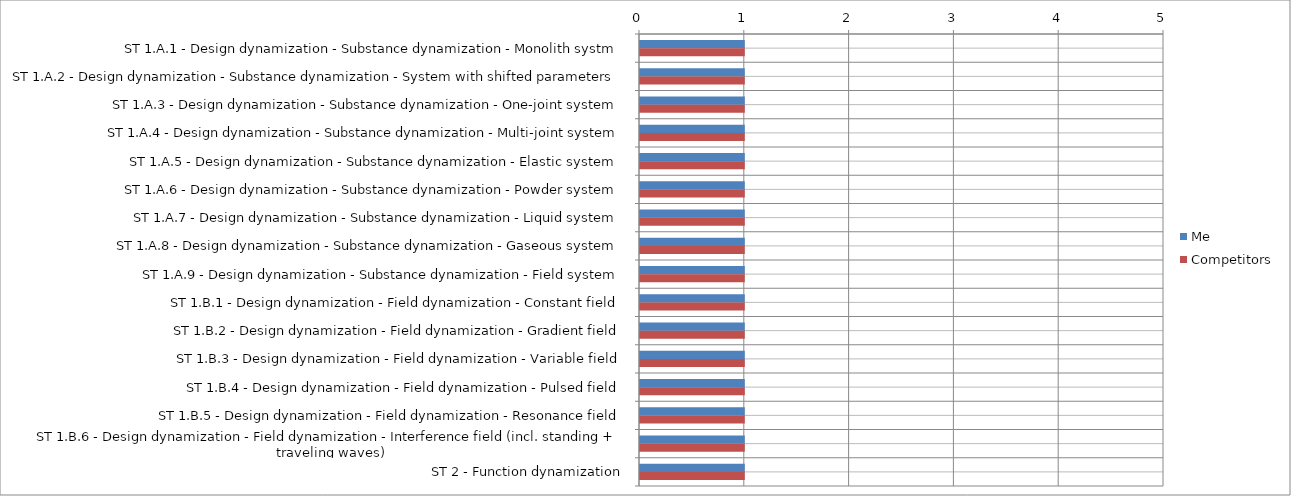
| Category | Me | Competitors |
|---|---|---|
| ST 1.A.1 - Design dynamization - Substance dynamization - Monolith systm | 1 | 1 |
| ST 1.A.2 - Design dynamization - Substance dynamization - System with shifted parameters | 1 | 1 |
| ST 1.A.3 - Design dynamization - Substance dynamization - One-joint system | 1 | 1 |
| ST 1.A.4 - Design dynamization - Substance dynamization - Multi-joint system | 1 | 1 |
| ST 1.A.5 - Design dynamization - Substance dynamization - Elastic system | 1 | 1 |
| ST 1.A.6 - Design dynamization - Substance dynamization - Powder system | 1 | 1 |
| ST 1.A.7 - Design dynamization - Substance dynamization - Liquid system | 1 | 1 |
| ST 1.A.8 - Design dynamization - Substance dynamization - Gaseous system | 1 | 1 |
| ST 1.A.9 - Design dynamization - Substance dynamization - Field system | 1 | 1 |
| ST 1.B.1 - Design dynamization - Field dynamization - Constant field | 1 | 1 |
| ST 1.B.2 - Design dynamization - Field dynamization - Gradient field | 1 | 1 |
| ST 1.B.3 - Design dynamization - Field dynamization - Variable field | 1 | 1 |
| ST 1.B.4 - Design dynamization - Field dynamization - Pulsed field | 1 | 1 |
| ST 1.B.5 - Design dynamization - Field dynamization - Resonance field | 1 | 1 |
| ST 1.B.6 - Design dynamization - Field dynamization - Interference field (incl. standing + traveling waves) | 1 | 1 |
| ST 2 - Function dynamization | 1 | 1 |